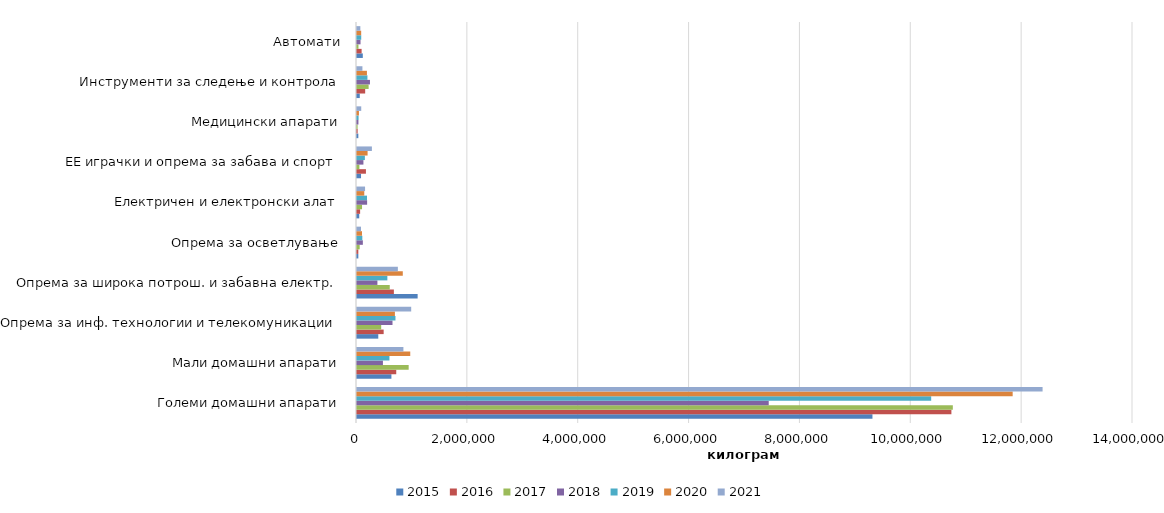
| Category | 2015 | 2016 | 2017 | 2018 | 2019 | 2020 | 2021 |
|---|---|---|---|---|---|---|---|
| Големи домашни апарати | 9299356.153 | 10723741.079 | 10749494.471 | 7428070.478 | 10359052.913 | 11829022.216 | 12368691.44 |
| Мали домашни апарати | 620805.426 | 707941.574 | 932214.969 | 467728.944 | 585167.81 | 960694.157 | 837138.29 |
| Опрема за инф. технологии и телекомуникации | 383938.723 | 481094.253 | 436555.25 | 640388.062 | 693947.092 | 683771.557 | 977748.6 |
| Опрема за широка потрош. и забавна електр. | 1093992.773 | 665294.401 | 590984.05 | 368178.777 | 547780.042 | 826137.466 | 737263.77 |
| Опрема за осветлување | 24124.171 | 23967.773 | 48442.698 | 105511.912 | 96211.753 | 90056.118 | 72116.91 |
| Електричен и електронски алат | 40429.404 | 56369.3 | 90879.854 | 182478.123 | 180766.352 | 131112.498 | 145473.87 |
| ЕЕ играчки и опрема за забава и спорт | 72735.55 | 161240.72 | 43108.79 | 115752.97 | 142155.21 | 191074.37 | 268745.79 |
| Медицински апарати | 23957.482 | 11762.253 | 10641.377 | 25826.333 | 28507.92 | 34944.28 | 76330.24 |
| Инструменти за следење и контрола | 50424.205 | 147609.02 | 209765.799 | 233821.012 | 188166.387 | 179120.329 | 97789.5 |
| Автомати | 104767.246 | 83450.43 | 26347.056 | 63687.067 | 76224.197 | 75422.496 | 60462.05 |